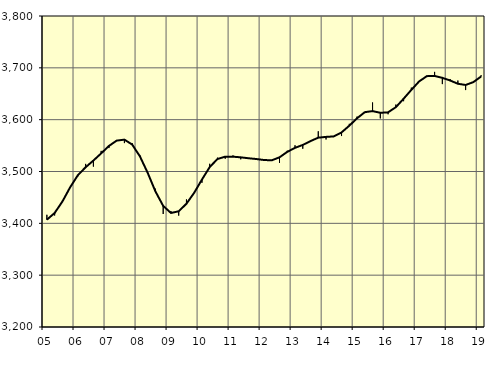
| Category | Trend | Säsongrensat |
|---|---|---|
| 5.0 | 3407.03 | 3416.5 |
| nan | 3419.96 | 3415.1 |
| 6.0 | 3442.02 | 3443.8 |
| 6.0 | 3469.51 | 3470 |
| 6.0 | 3493.04 | 3490.6 |
| nan | 3508.24 | 3514.7 |
| 7.0 | 3521.14 | 3509.4 |
| 7.0 | 3534.92 | 3539.8 |
| 7.0 | 3549.27 | 3545.2 |
| nan | 3559.58 | 3559.4 |
| 8.0 | 3561.49 | 3554.8 |
| 8.0 | 3551.98 | 3554.7 |
| 8.0 | 3529.16 | 3531.2 |
| nan | 3497.47 | 3498.2 |
| 9.0 | 3461.55 | 3466.8 |
| 9.0 | 3433.62 | 3418 |
| 9.0 | 3419.99 | 3423.7 |
| nan | 3423.24 | 3414.9 |
| 10.0 | 3437.84 | 3446.2 |
| 10.0 | 3459.04 | 3458.3 |
| 10.0 | 3484.53 | 3478.3 |
| nan | 3508.58 | 3514.9 |
| 11.0 | 3524.1 | 3526.7 |
| 11.0 | 3528.63 | 3524.6 |
| 11.0 | 3528.57 | 3531.1 |
| nan | 3527.36 | 3523.5 |
| 12.0 | 3525.56 | 3525.9 |
| 12.0 | 3524.09 | 3522.7 |
| 12.0 | 3522.17 | 3521.9 |
| nan | 3521.57 | 3521.8 |
| 13.0 | 3527.36 | 3516.5 |
| 13.0 | 3537.88 | 3540.1 |
| 13.0 | 3545.64 | 3550.6 |
| nan | 3551.26 | 3543.9 |
| 14.0 | 3558.69 | 3557 |
| 14.0 | 3565.27 | 3577.6 |
| 14.0 | 3566.77 | 3561.8 |
| nan | 3567.68 | 3568.1 |
| 15.0 | 3575.41 | 3568.4 |
| 15.0 | 3588.34 | 3592 |
| 15.0 | 3602.64 | 3605.9 |
| nan | 3614.5 | 3612.6 |
| 16.0 | 3616.53 | 3633.2 |
| 16.0 | 3613.27 | 3602.4 |
| 16.0 | 3614.12 | 3610.4 |
| nan | 3624.04 | 3629.1 |
| 17.0 | 3640.32 | 3635.6 |
| 17.0 | 3657.4 | 3661.8 |
| 17.0 | 3673.74 | 3673.2 |
| nan | 3683.96 | 3684.9 |
| 18.0 | 3684.36 | 3692.2 |
| 18.0 | 3680.71 | 3668.6 |
| 18.0 | 3675.59 | 3678.3 |
| nan | 3669.29 | 3675.5 |
| 19.0 | 3666.93 | 3657.1 |
| 19.0 | 3672.46 | 3672.6 |
| 19.0 | 3683.34 | 3685.7 |